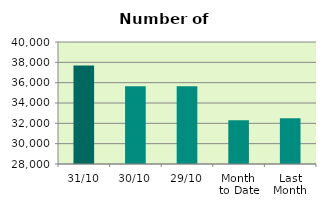
| Category | Series 0 |
|---|---|
| 31/10 | 37700 |
| 30/10 | 35650 |
| 29/10 | 35654 |
| Month 
to Date | 32305.043 |
| Last
Month | 32492.381 |